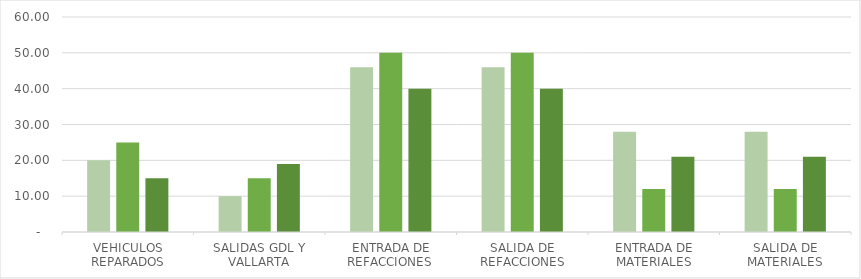
| Category | OCTUBRE | NOVIEMBRE | DICIEMBRE |
|---|---|---|---|
| VEHICULOS REPARADOS | 20 | 25 | 15 |
| SALIDAS GDL Y VALLARTA | 10 | 15 | 19 |
| ENTRADA DE REFACCIONES  | 46 | 50 | 40 |
| SALIDA DE REFACCIONES | 46 | 50 | 40 |
| ENTRADA DE MATERIALES | 28 | 12 | 21 |
| SALIDA DE MATERIALES | 28 | 12 | 21 |